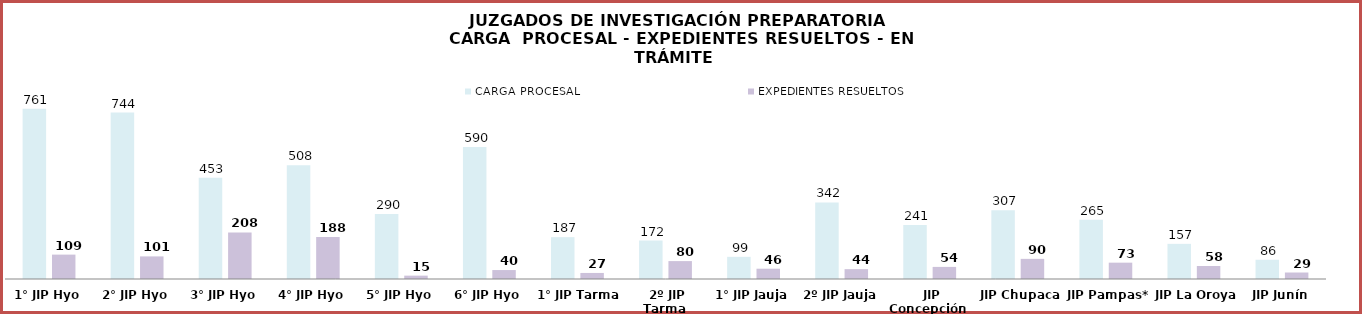
| Category | CARGA PROCESAL | EXPEDIENTES RESUELTOS |
|---|---|---|
| 1° JIP Hyo | 761 | 109 |
| 2° JIP Hyo | 744 | 101 |
| 3° JIP Hyo | 453 | 208 |
| 4° JIP Hyo | 508 | 188 |
| 5° JIP Hyo | 290 | 15 |
| 6° JIP Hyo | 590 | 40 |
| 1° JIP Tarma | 187 | 27 |
| 2º JIP Tarma | 172 | 80 |
| 1° JIP Jauja | 99 | 46 |
| 2º JIP Jauja | 342 | 44 |
| JIP Concepción | 241 | 54 |
| JIP Chupaca | 307 | 90 |
| JIP Pampas*  | 265 | 73 |
| JIP La Oroya | 157 | 58 |
| JIP Junín | 86 | 29 |